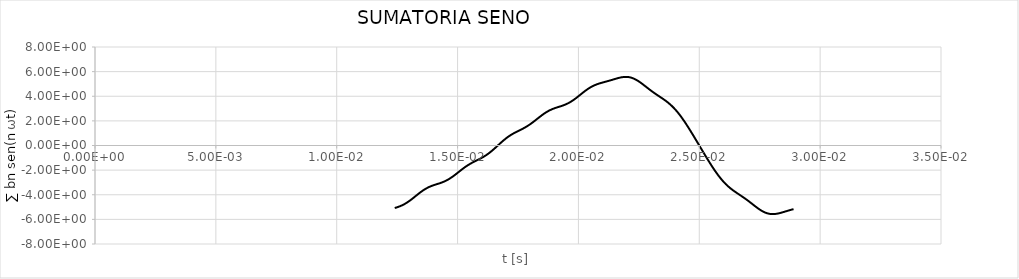
| Category | ∑ bn sen(nωt) |
|---|---|
| 0.0124 | -5.078 |
| 0.0125 | -5.017 |
| 0.0126 | -4.947 |
| 0.0127 | -4.863 |
| 0.0128 | -4.763 |
| 0.0129 | -4.646 |
| 0.013 | -4.513 |
| 0.0131 | -4.367 |
| 0.0132 | -4.212 |
| 0.0133 | -4.053 |
| 0.0134 | -3.896 |
| 0.0135 | -3.748 |
| 0.0136 | -3.612 |
| 0.0137 | -3.493 |
| 0.0138 | -3.39 |
| 0.0139 | -3.304 |
| 0.014 | -3.231 |
| 0.0141 | -3.167 |
| 0.0142 | -3.105 |
| 0.0143 | -3.04 |
| 0.0144 | -2.967 |
| 0.0145 | -2.88 |
| 0.0146 | -2.777 |
| 0.0147 | -2.658 |
| 0.0148 | -2.523 |
| 0.0149 | -2.377 |
| 0.015 | -2.223 |
| 0.0151 | -2.067 |
| 0.0152 | -1.914 |
| 0.0153 | -1.769 |
| 0.0154 | -1.635 |
| 0.0155 | -1.512 |
| 0.0156 | -1.402 |
| 0.0157 | -1.299 |
| 0.0158 | -1.202 |
| 0.0159 | -1.105 |
| 0.016 | -1.002 |
| 0.0161 | -0.889 |
| 0.0162 | -0.763 |
| 0.0163 | -0.622 |
| 0.0164 | -0.466 |
| 0.0165 | -0.298 |
| 0.0166 | -0.12 |
| 0.0167 | 0.06 |
| 0.0168 | 0.239 |
| 0.0169 | 0.411 |
| 0.017 | 0.572 |
| 0.0171 | 0.718 |
| 0.0172 | 0.849 |
| 0.0173 | 0.966 |
| 0.0174 | 1.071 |
| 0.0175 | 1.17 |
| 0.0176 | 1.267 |
| 0.0177 | 1.367 |
| 0.0178 | 1.474 |
| 0.0179 | 1.593 |
| 0.018 | 1.723 |
| 0.0181 | 1.865 |
| 0.0182 | 2.015 |
| 0.0183 | 2.171 |
| 0.0184 | 2.326 |
| 0.0185 | 2.475 |
| 0.0186 | 2.614 |
| 0.0187 | 2.739 |
| 0.0188 | 2.847 |
| 0.0189 | 2.939 |
| 0.019 | 3.017 |
| 0.0191 | 3.084 |
| 0.0192 | 3.146 |
| 0.0193 | 3.209 |
| 0.0194 | 3.279 |
| 0.0195 | 3.36 |
| 0.0196 | 3.457 |
| 0.0197 | 3.571 |
| 0.0198 | 3.701 |
| 0.0199 | 3.846 |
| 0.02 | 4 |
| 0.0201 | 4.159 |
| 0.0202 | 4.316 |
| 0.0203 | 4.466 |
| 0.0204 | 4.603 |
| 0.0205 | 4.726 |
| 0.0206 | 4.831 |
| 0.0207 | 4.92 |
| 0.0208 | 4.995 |
| 0.0209 | 5.058 |
| 0.021 | 5.115 |
| 0.0211 | 5.168 |
| 0.0212 | 5.222 |
| 0.0213 | 5.277 |
| 0.0214 | 5.336 |
| 0.0215 | 5.395 |
| 0.0216 | 5.453 |
| 0.0217 | 5.505 |
| 0.0218 | 5.545 |
| 0.0219 | 5.569 |
| 0.022 | 5.572 |
| 0.0221 | 5.55 |
| 0.0222 | 5.501 |
| 0.0223 | 5.425 |
| 0.0224 | 5.325 |
| 0.0225 | 5.203 |
| 0.0226 | 5.065 |
| 0.0227 | 4.916 |
| 0.0228 | 4.763 |
| 0.0229 | 4.61 |
| 0.023 | 4.46 |
| 0.0231 | 4.316 |
| 0.0232 | 4.179 |
| 0.0233 | 4.047 |
| 0.0234 | 3.917 |
| 0.0235 | 3.785 |
| 0.0236 | 3.646 |
| 0.0237 | 3.495 |
| 0.0238 | 3.329 |
| 0.0239 | 3.145 |
| 0.024 | 2.939 |
| 0.0241 | 2.711 |
| 0.0242 | 2.462 |
| 0.0243 | 2.194 |
| 0.0244 | 1.909 |
| 0.0245 | 1.61 |
| 0.0246 | 1.299 |
| 0.0247 | 0.981 |
| 0.0248 | 0.657 |
| 0.0249 | 0.329 |
| 0.025 | 0 |
| 0.0251 | -0.329 |
| 0.0252 | -0.657 |
| 0.0253 | -0.981 |
| 0.0254 | -1.299 |
| 0.0255 | -1.61 |
| 0.0256 | -1.909 |
| 0.0257 | -2.194 |
| 0.0258 | -2.462 |
| 0.0259 | -2.711 |
| 0.026 | -2.939 |
| 0.0261 | -3.145 |
| 0.0262 | -3.329 |
| 0.0263 | -3.495 |
| 0.0264 | -3.646 |
| 0.0265 | -3.785 |
| 0.0266 | -3.917 |
| 0.0267 | -4.047 |
| 0.0268 | -4.179 |
| 0.0269 | -4.316 |
| 0.027 | -4.46 |
| 0.0271 | -4.61 |
| 0.0272 | -4.763 |
| 0.0273 | -4.916 |
| 0.0274 | -5.065 |
| 0.0275 | -5.203 |
| 0.0276 | -5.325 |
| 0.0277 | -5.425 |
| 0.0278 | -5.501 |
| 0.0279 | -5.55 |
| 0.028 | -5.572 |
| 0.0281 | -5.569 |
| 0.0282 | -5.545 |
| 0.0283 | -5.505 |
| 0.0284 | -5.453 |
| 0.0285 | -5.395 |
| 0.0286 | -5.336 |
| 0.0287 | -5.277 |
| 0.0288 | -5.222 |
| 0.0289 | -5.168 |